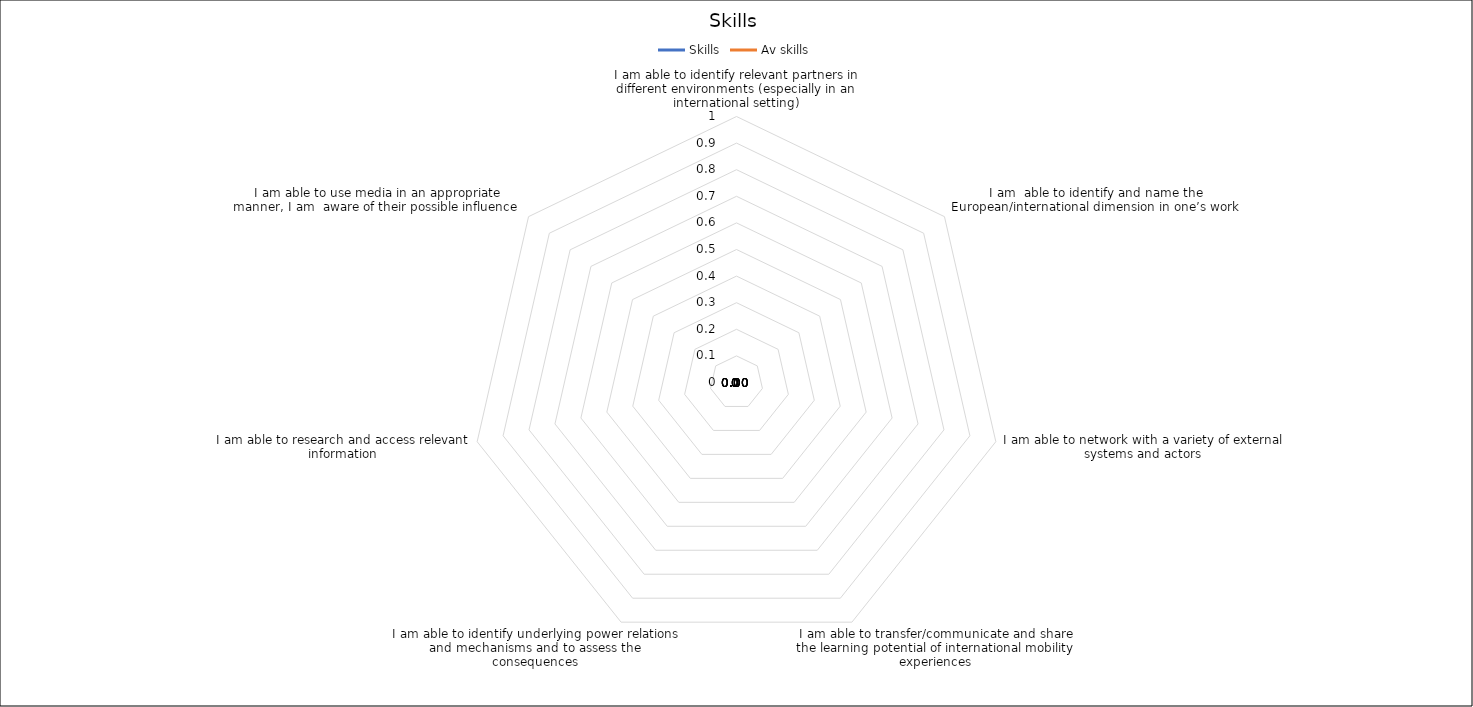
| Category | Skills | Av skills |
|---|---|---|
| I am able to identify relevant partners in different environments (especially in an international setting) | 0 | 0 |
| I am  able to identify and name the European/international dimension in one’s work | 0 | 0 |
| I am able to network with a variety of external systems and actors | 0 | 0 |
| I am able to transfer/communicate and share the learning potential of international mobility experiences | 0 | 0 |
| I am able to identify underlying power relations and mechanisms and to assess the consequences | 0 | 0 |
| I am able to research and access relevant information | 0 | 0 |
| I am able to use media in an appropriate manner, I am  aware of their possible influence  | 0 | 0 |